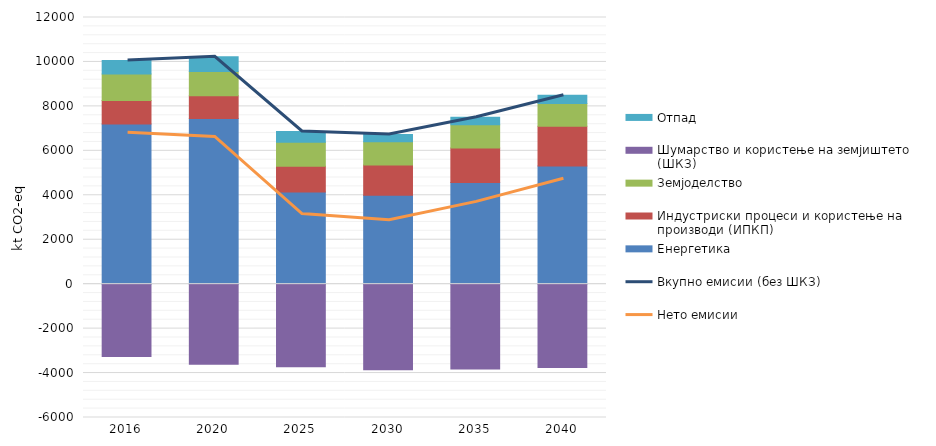
| Category | Енергетика  | Индустриски процеси и користење на производи (ИПКП) | Земјоделство | Шумарство и користење на земјиштето (ШКЗ) | Отпад |
|---|---|---|---|---|---|
| 2016.0 | 7205 | 1056 | 1191 | -3253 | 610 |
| 2020.0 | 7454 | 1024 | 1093 | -3604 | 659 |
| 2025.0 | 4143 | 1163 | 1075 | -3719 | 492 |
| 2030.0 | 4006 | 1352 | 1055 | -3855 | 324 |
| 2035.0 | 4571 | 1562 | 1036 | -3813 | 346 |
| 2040.0 | 5319 | 1792 | 1021 | -3754 | 366 |